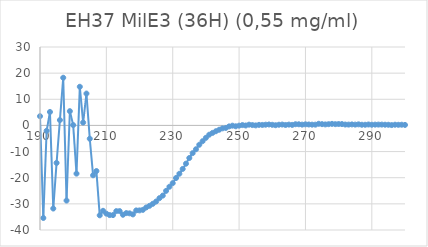
| Category | Series 0 |
|---|---|
| 300.0 | 0.195 |
| 299.0 | 0.267 |
| 298.0 | 0.239 |
| 297.0 | 0.272 |
| 296.0 | 0.135 |
| 295.0 | 0.252 |
| 294.0 | 0.27 |
| 293.0 | 0.314 |
| 292.0 | 0.318 |
| 291.0 | 0.306 |
| 290.0 | 0.257 |
| 289.0 | 0.356 |
| 288.0 | 0.252 |
| 287.0 | 0.259 |
| 286.0 | 0.413 |
| 285.0 | 0.315 |
| 284.0 | 0.382 |
| 283.0 | 0.322 |
| 282.0 | 0.342 |
| 281.0 | 0.515 |
| 280.0 | 0.539 |
| 279.0 | 0.491 |
| 278.0 | 0.599 |
| 277.0 | 0.479 |
| 276.0 | 0.392 |
| 275.0 | 0.484 |
| 274.0 | 0.626 |
| 273.0 | 0.295 |
| 272.0 | 0.293 |
| 271.0 | 0.361 |
| 270.0 | 0.415 |
| 269.0 | 0.307 |
| 268.0 | 0.439 |
| 267.0 | 0.457 |
| 266.0 | 0.206 |
| 265.0 | 0.315 |
| 264.0 | 0.179 |
| 263.0 | 0.333 |
| 262.0 | 0.266 |
| 261.0 | 0.081 |
| 260.0 | 0.237 |
| 259.0 | 0.36 |
| 258.0 | 0.28 |
| 257.0 | 0.191 |
| 256.0 | 0.218 |
| 255.0 | 0.016 |
| 254.0 | 0.137 |
| 253.0 | 0.293 |
| 252.0 | -0.027 |
| 251.0 | 0.133 |
| 250.0 | -0.086 |
| 249.0 | -0.324 |
| 248.0 | -0.098 |
| 247.0 | -0.372 |
| 246.0 | -0.96 |
| 245.0 | -1.12 |
| 244.0 | -1.646 |
| 243.0 | -2.226 |
| 242.0 | -2.856 |
| 241.0 | -3.545 |
| 240.0 | -4.743 |
| 239.0 | -6.029 |
| 238.0 | -7.394 |
| 237.0 | -9.118 |
| 236.0 | -10.607 |
| 235.0 | -12.457 |
| 234.0 | -14.623 |
| 233.0 | -16.65 |
| 232.0 | -18.487 |
| 231.0 | -20.116 |
| 230.0 | -22.073 |
| 229.0 | -23.464 |
| 228.0 | -25.032 |
| 227.0 | -26.836 |
| 226.0 | -27.824 |
| 225.0 | -29.102 |
| 224.0 | -29.979 |
| 223.0 | -30.746 |
| 222.0 | -31.385 |
| 221.0 | -32.298 |
| 220.0 | -32.498 |
| 219.0 | -32.511 |
| 218.0 | -34.035 |
| 217.0 | -33.633 |
| 216.0 | -33.533 |
| 215.0 | -34.171 |
| 214.0 | -32.768 |
| 213.0 | -32.78 |
| 212.0 | -34.301 |
| 211.0 | -34.292 |
| 210.0 | -33.74 |
| 209.0 | -32.658 |
| 208.0 | -34.384 |
| 207.0 | -17.441 |
| 206.0 | -19.071 |
| 205.0 | -5.088 |
| 204.0 | 12.19 |
| 203.0 | 1.096 |
| 202.0 | 14.783 |
| 201.0 | -18.444 |
| 200.0 | 0.139 |
| 199.0 | 5.456 |
| 198.0 | -28.742 |
| 197.0 | 18.241 |
| 196.0 | 2.052 |
| 195.0 | -14.336 |
| 194.0 | -31.786 |
| 193.0 | 5.148 |
| 192.0 | -2.035 |
| 191.0 | -35.407 |
| 190.0 | 3.53 |